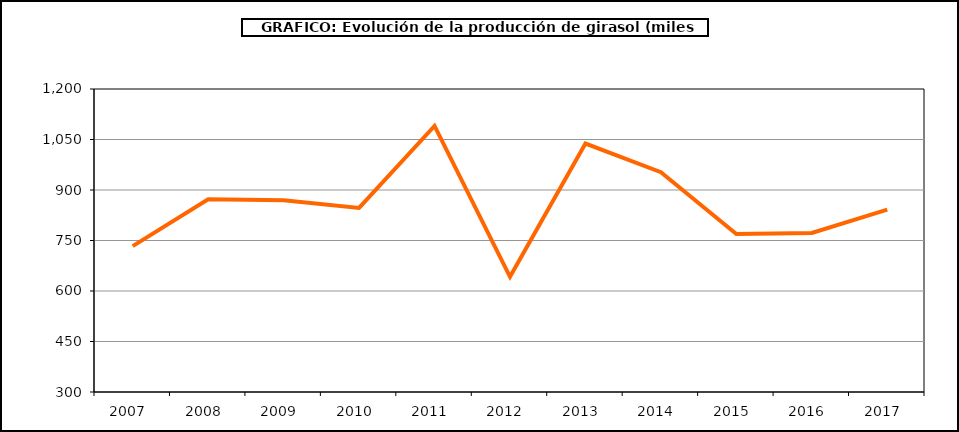
| Category | Producción |
|---|---|
| 2007.0 | 733.154 |
| 2008.0 | 872.687 |
| 2009.0 | 869.54 |
| 2010.0 | 846.648 |
| 2011.0 | 1090.171 |
| 2012.0 | 642.017 |
| 2013.0 | 1038.071 |
| 2014.0 | 952.986 |
| 2015.0 | 769.195 |
| 2016.0 | 772.18 |
| 2017.0 | 841.74 |